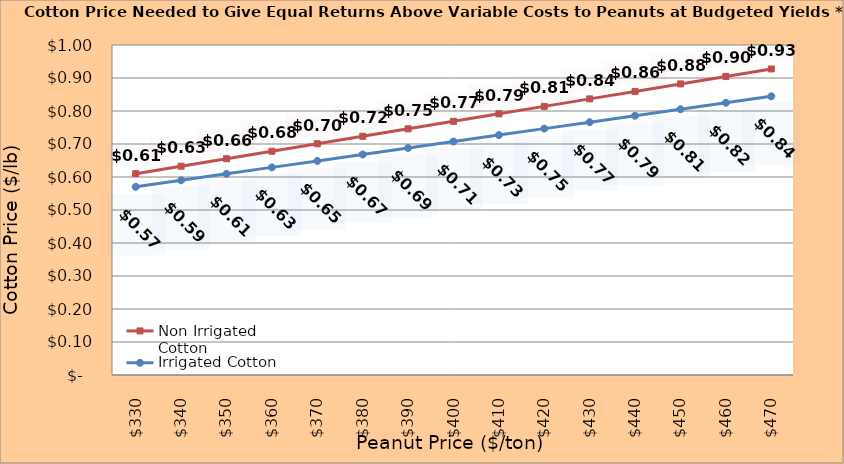
| Category | Non Irrigated Cotton | Irrigated Cotton |
|---|---|---|
| 330.0 | 0.61 | 0.57 |
| 340.0 | 0.633 | 0.59 |
| 350.0 | 0.655 | 0.61 |
| 360.0 | 0.678 | 0.629 |
| 370.0 | 0.701 | 0.649 |
| 380.0 | 0.723 | 0.668 |
| 390.0 | 0.746 | 0.688 |
| 400.0 | 0.769 | 0.707 |
| 410.0 | 0.791 | 0.727 |
| 420.0 | 0.814 | 0.747 |
| 430.0 | 0.837 | 0.766 |
| 440.0 | 0.859 | 0.786 |
| 450.0 | 0.882 | 0.805 |
| 460.0 | 0.905 | 0.825 |
| 470.0 | 0.927 | 0.845 |